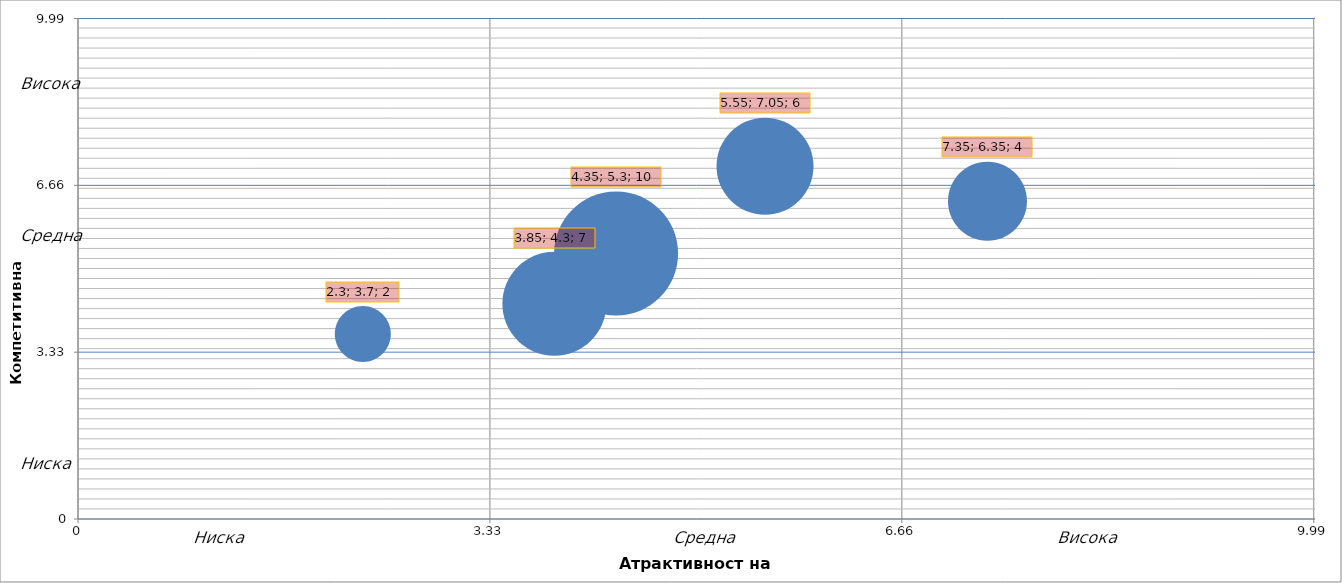
| Category | Series 0 |
|---|---|
| 3.8499999999999996 | 4.3 |
| 2.3 | 3.7 |
| 4.3500000000000005 | 5.3 |
| 5.55 | 7.05 |
| 7.3500000000000005 | 6.35 |
| 0.0 | 0 |
| 0.0 | 0 |
| 0.0 | 0 |
| 0.0 | 0 |
| 0.0 | 0 |